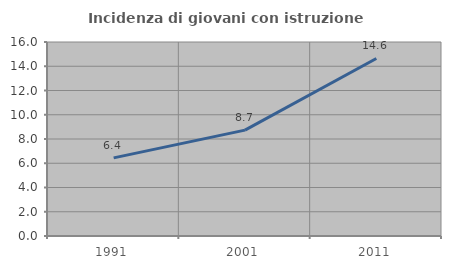
| Category | Incidenza di giovani con istruzione universitaria |
|---|---|
| 1991.0 | 6.441 |
| 2001.0 | 8.732 |
| 2011.0 | 14.64 |